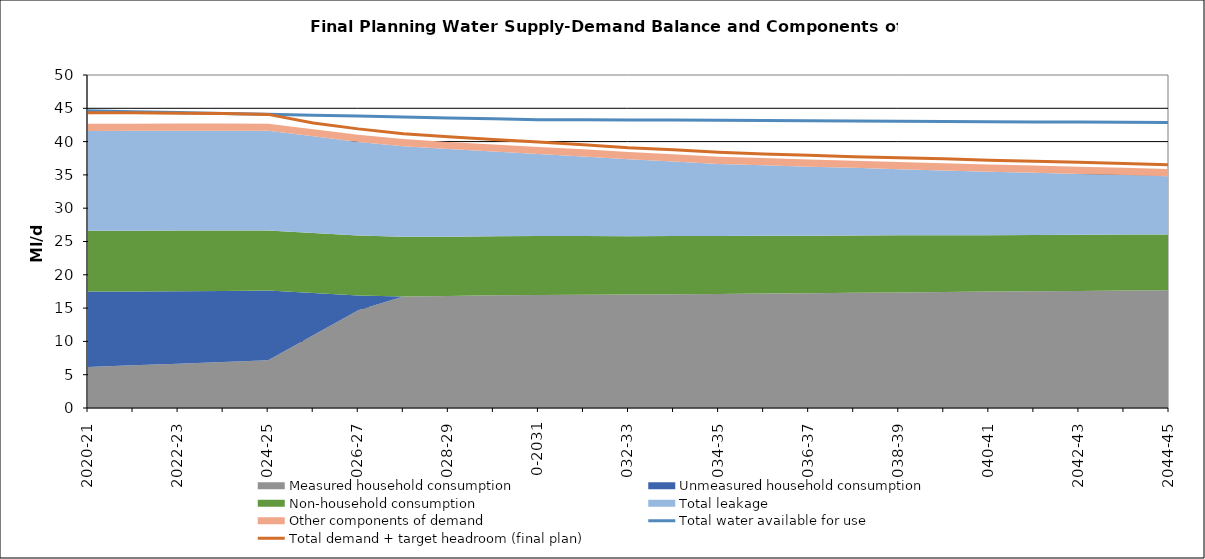
| Category | Total water available for use | Total demand + target headroom (final plan) |
|---|---|---|
| 0 | 44.63 | 44.349 |
| 1 | 44.49 | 44.329 |
| 2 | 44.36 | 44.269 |
| 3 | 44.23 | 44.208 |
| 4 | 44.09 | 44.087 |
| 5 | 43.96 | 42.804 |
| 6 | 43.83 | 41.912 |
| 7 | 43.69 | 41.172 |
| 8 | 43.56 | 40.729 |
| 9 | 43.43 | 40.307 |
| 10 | 43.29 | 39.935 |
| 11 | 43.29 | 39.51 |
| 12 | 43.26 | 39.06 |
| 13 | 43.23 | 38.766 |
| 14 | 43.19 | 38.384 |
| 15 | 43.16 | 38.149 |
| 16 | 43.13 | 37.949 |
| 17 | 43.09 | 37.734 |
| 18 | 43.06 | 37.584 |
| 19 | 43.03 | 37.442 |
| 20 | 42.99 | 37.193 |
| 21 | 42.96 | 37.055 |
| 22 | 42.93 | 36.883 |
| 23 | 42.89 | 36.725 |
| 24 | 42.86 | 36.528 |